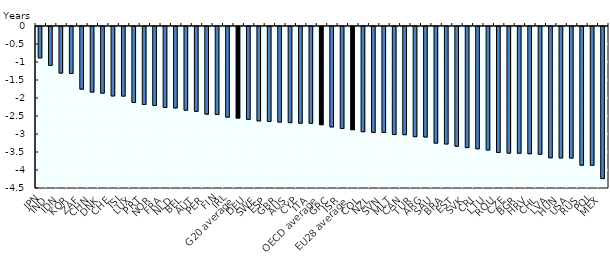
| Category | LE |
|---|---|
| JPN | -0.871 |
| IND | -1.08 |
| IDN | -1.295 |
| KOR | -1.304 |
| ZAF | -1.741 |
| CHN | -1.823 |
| DNK | -1.852 |
| CHE | -1.93 |
| ISL | -1.933 |
| LUX | -2.111 |
| PRT | -2.166 |
| NOR | -2.192 |
| FRA | -2.25 |
| NLD | -2.263 |
| BEL | -2.324 |
| AUT | -2.357 |
| PER | -2.434 |
| FIN | -2.444 |
| IRL | -2.519 |
| G20 average | -2.544 |
| DEU | -2.58 |
| SWE | -2.621 |
| ESP | -2.637 |
| GBR | -2.655 |
| AUS | -2.67 |
| CYP | -2.687 |
| ITA | -2.689 |
| OECD average | -2.727 |
| GRC | -2.79 |
| ISR | -2.833 |
| EU28 average | -2.866 |
| COL | -2.923 |
| NZL | -2.944 |
| SVN | -2.944 |
| MLT | -3.001 |
| CAN | -3.005 |
| TUR | -3.06 |
| ARG | -3.07 |
| SAU | -3.24 |
| BRA | -3.264 |
| EST | -3.325 |
| SVK | -3.364 |
| CRI | -3.396 |
| LTU | -3.431 |
| ROU | -3.499 |
| CZE | -3.518 |
| BGR | -3.521 |
| HRV | -3.534 |
| CHL | -3.549 |
| LVA | -3.648 |
| HUN | -3.65 |
| USA | -3.655 |
| RUS | -3.853 |
| POL | -3.856 |
| MEX | -4.225 |